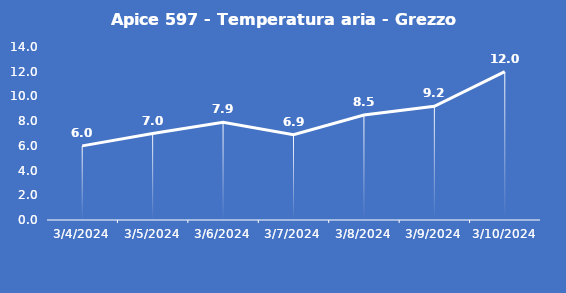
| Category | Apice 597 - Temperatura aria - Grezzo (°C) |
|---|---|
| 3/4/24 | 6 |
| 3/5/24 | 7 |
| 3/6/24 | 7.9 |
| 3/7/24 | 6.9 |
| 3/8/24 | 8.5 |
| 3/9/24 | 9.2 |
| 3/10/24 | 12 |